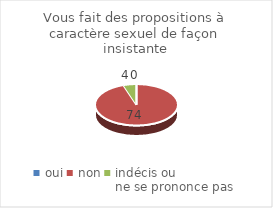
| Category | Vous fait des propositions à caractère sexuel de façon insistante |
|---|---|
| oui | 0 |
| non | 74 |
| indécis ou 
ne se prononce pas | 4 |